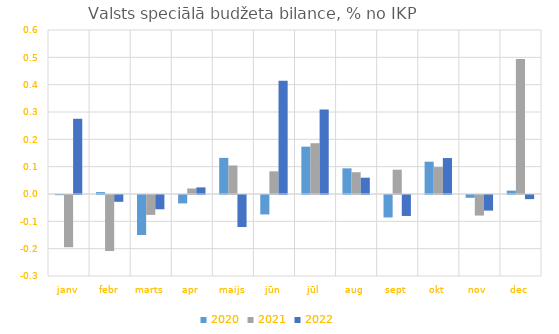
| Category | 2020 | 2021 | 2022 |
|---|---|---|---|
| janv | -0.001 | -0.191 | 0.275 |
| febr | 0.007 | -0.205 | -0.025 |
| marts | -0.146 | -0.073 | -0.052 |
| apr | -0.031 | 0.02 | 0.024 |
| maijs | 0.132 | 0.104 | -0.117 |
| jūn | -0.071 | 0.083 | 0.415 |
| jūl | 0.173 | 0.186 | 0.309 |
| aug | 0.094 | 0.08 | 0.06 |
| sept | -0.082 | 0.089 | -0.077 |
| okt | 0.118 | 0.099 | 0.132 |
| nov | -0.01 | -0.075 | -0.057 |
| dec | 0.012 | 0.494 | -0.015 |